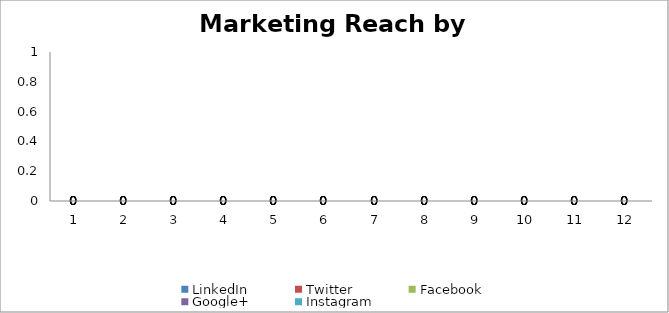
| Category | LinkedIn | Twitter | Facebook | Google+ | Instagram |
|---|---|---|---|---|---|
| 0 | 0 | 0 | 0 | 0 | 0 |
| 1 | 0 | 0 | 0 | 0 | 0 |
| 2 | 0 | 0 | 0 | 0 | 0 |
| 3 | 0 | 0 | 0 | 0 | 0 |
| 4 | 0 | 0 | 0 | 0 | 0 |
| 5 | 0 | 0 | 0 | 0 | 0 |
| 6 | 0 | 0 | 0 | 0 | 0 |
| 7 | 0 | 0 | 0 | 0 | 0 |
| 8 | 0 | 0 | 0 | 0 | 0 |
| 9 | 0 | 0 | 0 | 0 | 0 |
| 10 | 0 | 0 | 0 | 0 | 0 |
| 11 | 0 | 0 | 0 | 0 | 0 |